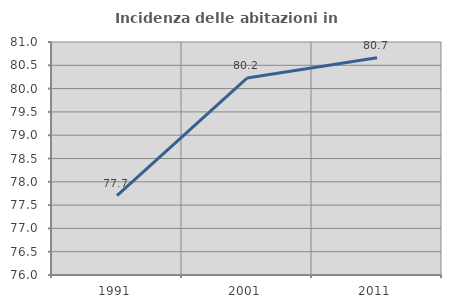
| Category | Incidenza delle abitazioni in proprietà  |
|---|---|
| 1991.0 | 77.702 |
| 2001.0 | 80.227 |
| 2011.0 | 80.66 |